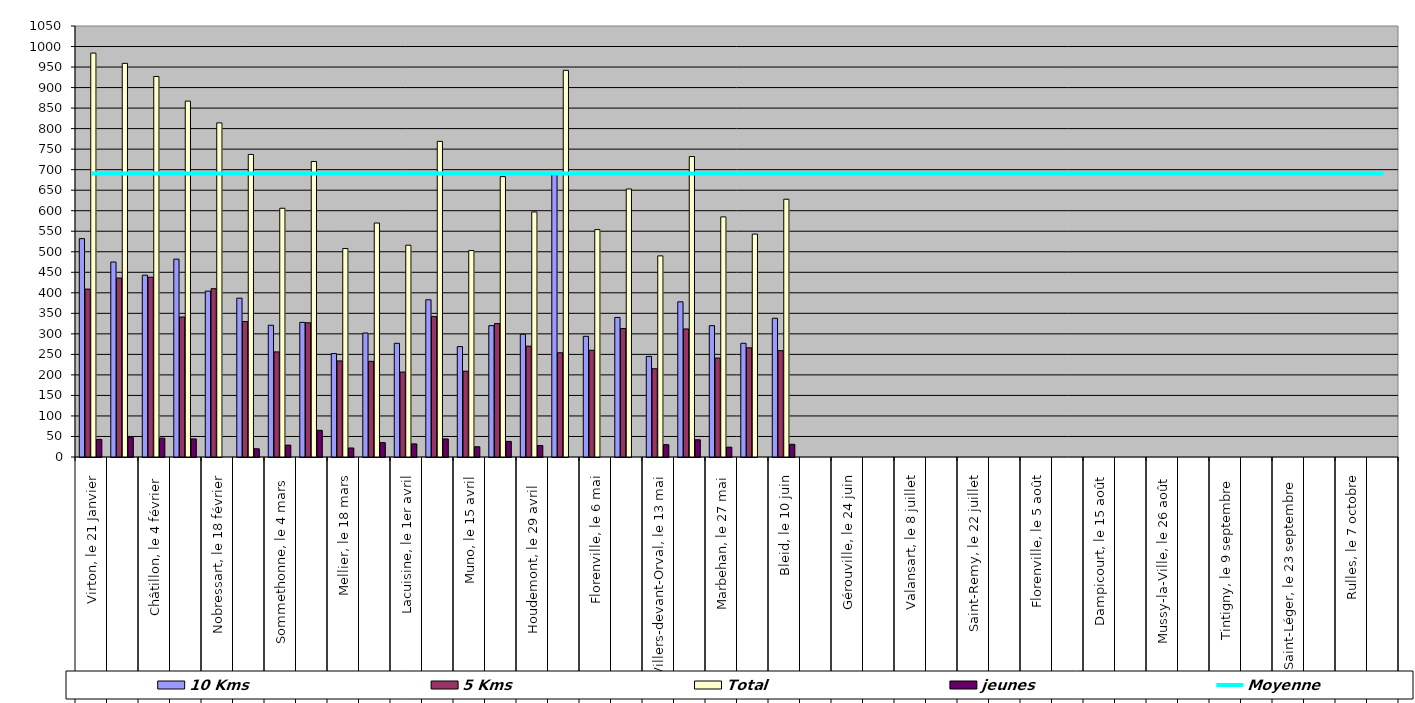
| Category | 10 Kms | 5 Kms | Total | jeunes |
|---|---|---|---|---|
| 0 | 532 | 409 | 984 | 43 |
| 1 | 475 | 436 | 959 | 48 |
| 2 | 443 | 438 | 927 | 46 |
| 3 | 482 | 341 | 867 | 44 |
| 4 | 404 | 410 | 814 | 0 |
| 5 | 387 | 330 | 737 | 20 |
| 6 | 321 | 256 | 606 | 29 |
| 7 | 328 | 327 | 720 | 65 |
| 8 | 252 | 234 | 508 | 22 |
| 9 | 302 | 233 | 570 | 35 |
| 10 | 277 | 207 | 516 | 32 |
| 11 | 383 | 342 | 769 | 44 |
| 12 | 269 | 209 | 503 | 25 |
| 13 | 320 | 325 | 683 | 38 |
| 14 | 299 | 270 | 597 | 28 |
| 15 | 688 | 254 | 942 | 0 |
| 16 | 294 | 260 | 554 | 0 |
| 17 | 340 | 313 | 653 | 0 |
| 18 | 245 | 215 | 490 | 30 |
| 19 | 378 | 312 | 732 | 42 |
| 20 | 320 | 241 | 585 | 24 |
| 21 | 277 | 266 | 543 | 0 |
| 22 | 338 | 259 | 628 | 31 |
| 23 | 0 | 0 | 0 | 0 |
| 24 | 0 | 0 | 0 | 0 |
| 25 | 0 | 0 | 0 | 0 |
| 26 | 0 | 0 | 0 | 0 |
| 27 | 0 | 0 | 0 | 0 |
| 28 | 0 | 0 | 0 | 0 |
| 29 | 0 | 0 | 0 | 0 |
| 30 | 0 | 0 | 0 | 0 |
| 31 | 0 | 0 | 0 | 0 |
| 32 | 0 | 0 | 0 | 0 |
| 33 | 0 | 0 | 0 | 0 |
| 34 | 0 | 0 | 0 | 0 |
| 35 | 0 | 0 | 0 | 0 |
| 36 | 0 | 0 | 0 | 0 |
| 37 | 0 | 0 | 0 | 0 |
| 38 | 0 | 0 | 0 | 0 |
| 39 | 0 | 0 | 0 | 0 |
| 40 | 0 | 0 | 0 | 0 |
| 41 | 0 | 0 | 0 | 0 |